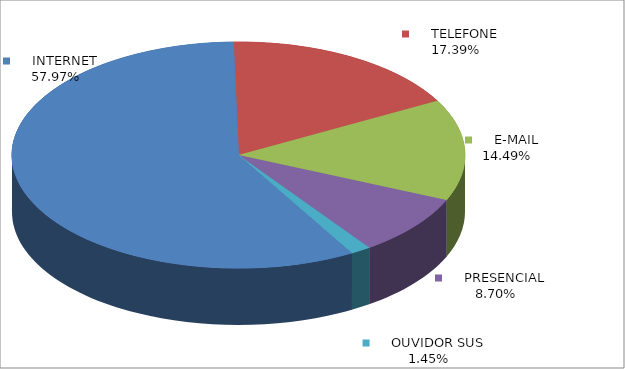
| Category | Series 0 |
|---|---|
|      INTERNET | 0.58 |
|      TELEFONE | 0.174 |
|      E-MAIL | 0.145 |
|      PRESENCIAL | 0.087 |
|      OUVIDOR SUS | 0.014 |